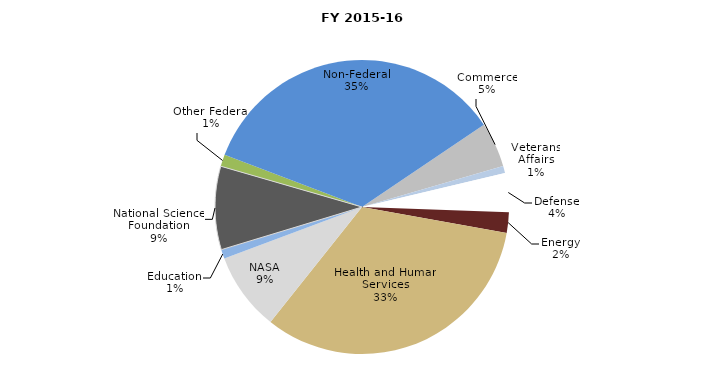
| Category | Series 0 |
|---|---|
| Commerce | 45584521 |
| Veterans Affairs | 7460245 |
| Defense | 39364128 |
| Energy | 21022458 |
| Health and Human Services | 303652052 |
| NASA | 79593383 |
| Education | 9267333 |
| National Science Foundation | 84606741 |
| Other Federal | 12074759 |
| Non-Federal | 321310477.42 |